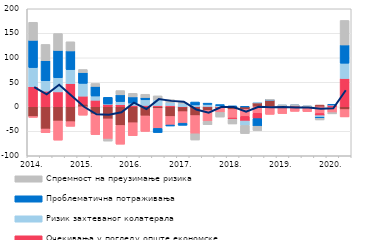
| Category | Трошкови извора за кредите | Конкуренција осталих банака | Очекивања у погледу опште економске ситуације | Ризик захтеваног колатерала | Проблематична потраживања | Спремност на преузимање ризика |
|---|---|---|---|---|---|---|
| 2014. | -19.9 | -1.7 | 41 | 39.1 | 55.5 | 36.9 |
|  | -45.3 | -7.7 | 31.9 | 21.4 | 40.8 | 33.2 |
|  | -29 | -39.1 | 30.4 | 28.9 | 55.7 | 34.4 |
|  | -30.3 | -9.6 | 47.3 | 28.6 | 38.1 | 18.7 |
| 2015. | 5.3 | -17.2 | 16.4 | 26.1 | 22.1 | 6.2 |
|  | -14.5 | -42.3 | 13.3 | 8.7 | 19.6 | 6 |
|  | -24.7 | -41.2 | 5.2 | 0.6 | 13.5 | -4.1 |
|  | -38.1 | -38.3 | 4.2 | 6.5 | 13.7 | 8.7 |
| 2016. | -32.5 | -26.6 | 2.8 | 4.8 | 12.6 | 7.3 |
|  | -18.6 | -31.7 | 2.8 | 11.4 | 4.8 | 6.6 |
|  | -3.2 | -40.9 | 2.6 | 11.7 | -8.5 | 8 |
|  | -19.7 | -17.5 | 2.6 | 6.4 | -2 | 5.6 |
| 2017. | -9.9 | -23.6 | 0.3 | 6.6 | -4.3 | 1.9 |
|  | -17.9 | -37.2 | 0.4 | 3.4 | 5.9 | -12.7 |
|  | -7.4 | -22.4 | 0.6 | 4.3 | 2.5 | -6.8 |
|  | -2.2 | -9.3 | 0.1 | 2.2 | 2.2 | -9.5 |
| 2018. | -5.5 | -17.5 | -2.5 | 0 | 1.9 | -9.6 |
|  | -5.2 | -14.4 | -9.5 | -9.1 | 0.3 | -16.5 |
|  | 8.2 | -13.3 | -10.8 | 0.3 | -15.6 | -8.9 |
|  | 13.5 | -15.5 | 0.1 | 0.3 | 0.3 | 0.1 |
| 2019. | 0 | -14 | 0.1 | 2.4 | 0.3 | 0.1 |
|  | 2.3 | -9.4 | 0.1 | 0.3 | 0.3 | 0.1 |
|  | 0 | -9.9 | 0.1 | 0.4 | 0.4 | 0.1 |
|  | 3.5 | -13.7 | -4.4 | -3.2 | -2.2 | -3.4 |
| 2020. | 0 | -11.9 | 3.7 | 0.4 | 0.4 | -2.6 |